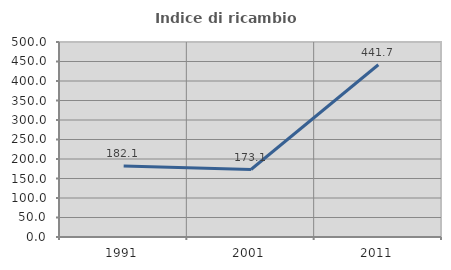
| Category | Indice di ricambio occupazionale  |
|---|---|
| 1991.0 | 182.143 |
| 2001.0 | 173.077 |
| 2011.0 | 441.667 |